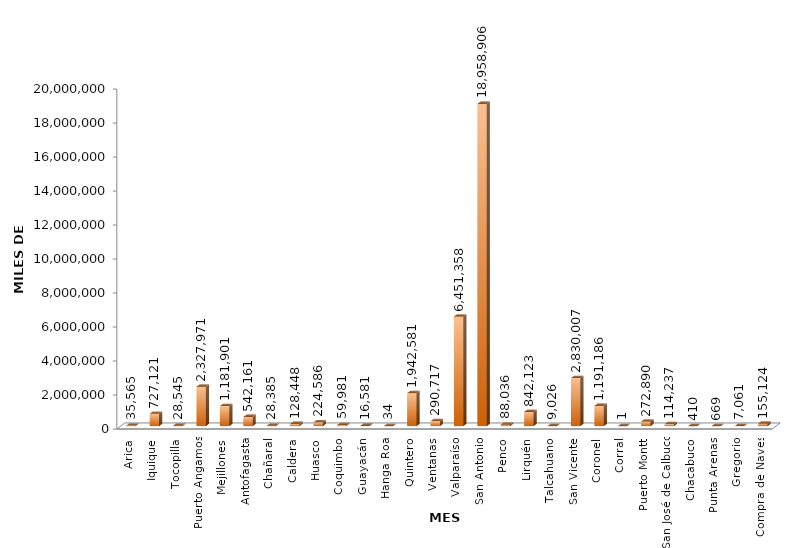
| Category | Series 0 |
|---|---|
| Arica | 35565.368 |
| Iquique | 727120.923 |
| Tocopilla | 28545.246 |
| Puerto Angamos | 2327971.284 |
| Mejillones | 1181900.56 |
| Antofagasta | 542161.329 |
| Chañaral | 28384.804 |
| Caldera | 128448.435 |
| Huasco | 224586.414 |
| Coquimbo | 59980.856 |
| Guayacán | 16581.435 |
| Hanga Roa | 34.372 |
| Quintero | 1942581.488 |
| Ventanas | 290716.572 |
| Valparaíso | 6451357.689 |
| San Antonio | 18958906.051 |
| Penco | 88036.442 |
| Lirquén | 842122.553 |
| Talcahuano | 9025.972 |
| San Vicente | 2830006.717 |
| Coronel | 1191185.808 |
| Corral | 1.052 |
| Puerto Montt | 272890.083 |
| San José de Calbuco | 114236.81 |
| Chacabuco | 410.171 |
| Punta Arenas | 668.851 |
| Gregorio | 7061.165 |
| Compra de Naves | 155123.709 |